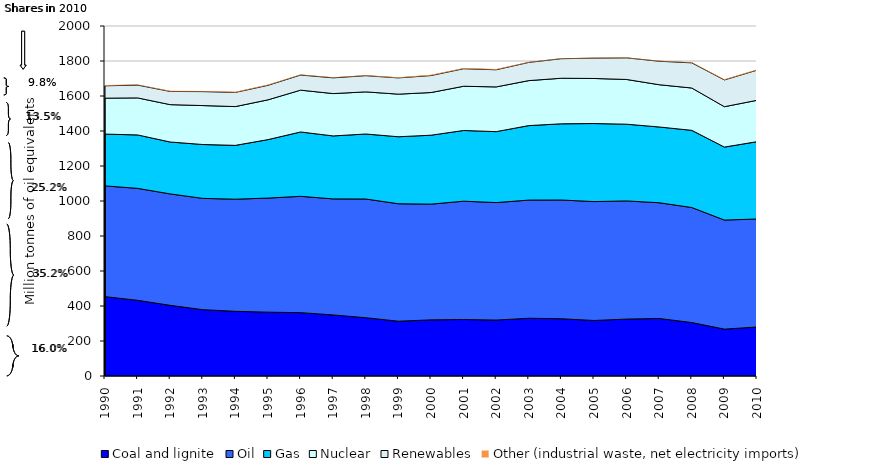
| Category | Coal and lignite | Oil | Gas | Nuclear | Renewables | Other (industrial waste, net electricity imports) |
|---|---|---|---|---|---|---|
| 1990.0 | 453.431 | 632.935 | 295.934 | 205.205 | 70.724 | 5.089 |
| 1991.0 | 432.512 | 639.631 | 305.417 | 211.54 | 73.145 | 3.124 |
| 1992.0 | 403.792 | 636.771 | 296.559 | 213.494 | 75.278 | 3.937 |
| 1993.0 | 379.015 | 635.947 | 307.831 | 222.483 | 79.779 | 3.925 |
| 1994.0 | 369.73 | 640.568 | 307.586 | 221.591 | 80.798 | 4.002 |
| 1995.0 | 364.71 | 651.906 | 334.141 | 227.301 | 82.92 | 4.538 |
| 1996.0 | 361.971 | 664.779 | 367.692 | 238.954 | 86.41 | 2.642 |
| 1997.0 | 348.929 | 663.048 | 359.84 | 241.966 | 89.95 | 3.129 |
| 1998.0 | 332.972 | 678.395 | 371.403 | 240.716 | 92.509 | 2.825 |
| 1999.0 | 313.156 | 671.215 | 382.794 | 243.431 | 92.765 | 3.677 |
| 2000.0 | 320.845 | 661.154 | 393.935 | 243.841 | 96.98 | 4.501 |
| 2001.0 | 322.724 | 676.221 | 404.047 | 252.665 | 99.985 | 3.938 |
| 2002.0 | 319.726 | 671.18 | 405.498 | 255.556 | 97.773 | 4.536 |
| 2003.0 | 330.051 | 675.205 | 425.596 | 257.017 | 103.952 | 3.008 |
| 2004.0 | 327.159 | 678.529 | 435.469 | 260.286 | 111.609 | 2.637 |
| 2005.0 | 317.303 | 679.346 | 446.003 | 257.516 | 116.038 | 2.965 |
| 2006.0 | 325.305 | 675.111 | 438.506 | 255.499 | 123.416 | 2.325 |
| 2007.0 | 328.707 | 661.305 | 432.963 | 241.41 | 134.117 | 3.347 |
| 2008.0 | 305.518 | 657.193 | 441.01 | 241.909 | 143.774 | 3.637 |
| 2009.0 | 267.918 | 623.159 | 416.962 | 230.767 | 152.729 | 4.723 |
| 2010.0 | 279.97 | 617.094 | 441.796 | 236.563 | 172.142 | 4.022 |